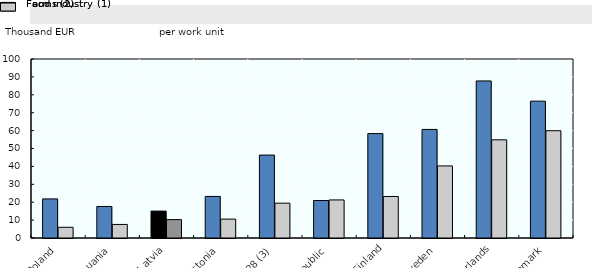
| Category | Food industry (1) | Farms (2) |
|---|---|---|
| Poland | 21.832 | 5.985 |
| Lithuania | 17.613 | 7.573 |
| Latvia | 15.032 | 10.27 |
| Estonia | 23.215 | 10.558 |
| EU28 (3) | 46.324 | 19.461 |
| Czech Republic | 20.936 | 21.272 |
| Finland | 58.332 | 23.189 |
| Sweden | 60.656 | 40.275 |
| Netherlands | 87.751 | 54.845 |
| Denmark | 76.452 | 59.939 |